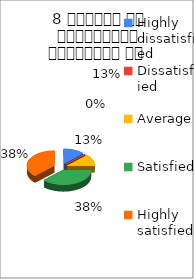
| Category | 8 शिक्षक का सम्प्रेषण सुस्पष्ठ है  |
|---|---|
| Highly dissatisfied | 1 |
| Dissatisfied | 0 |
| Average | 1 |
| Satisfied | 3 |
| Highly satisfied | 3 |